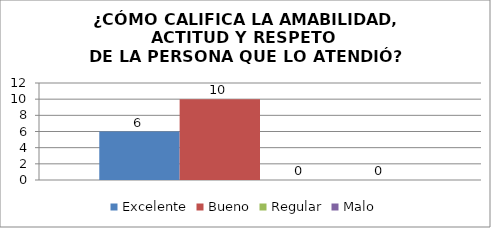
| Category | Excelente | Bueno | Regular | Malo |
|---|---|---|---|---|
| 0 | 6 | 10 | 0 | 0 |